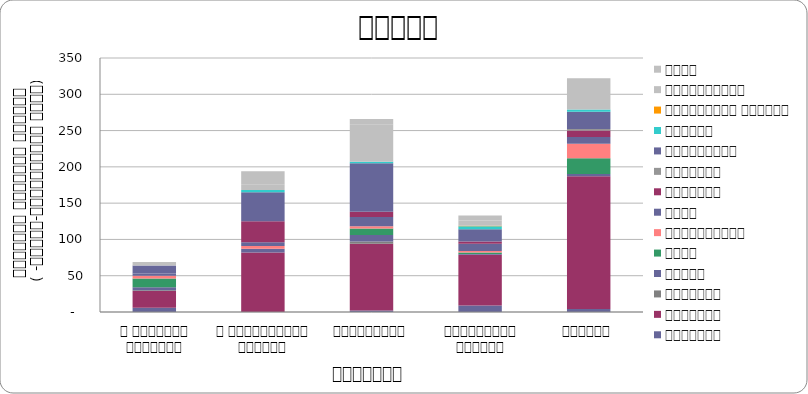
| Category | सुरक्षा | राजनीति | आन्दोलन | न्याय | शासन | अर्थतन्त्र | समाज | कुटनीति | वातावरण | स्वास्थ्य  | शिक्षा | प्राकृतिक प्रकोप | भ्रष्टाचार | अन्य |
|---|---|---|---|---|---|---|---|---|---|---|---|---|---|---|
| द हिमालयन टाइम्स् | 6 | 23 | 1 | 4 | 12 | 4 | 3 | 0 | 0 | 11 | 0 | 0 | 2 | 3 |
| द काठमाण्डौं पोस्ट् | 0 | 82 | 0 | 5 | 0 | 4 | 5 | 29 | 0 | 40 | 3 | 0 | 8 | 18 |
| कान्तिपुर | 2 | 92 | 3 | 9 | 9 | 3 | 13 | 7 | 0 | 67 | 2 | 0 | 51 | 8 |
| अन्नपूर्ण पोस्ट् | 9 | 70 | 0 | 1 | 2 | 2 | 10 | 3 | 0 | 17 | 4 | 1 | 7 | 7 |
| नागरिक | 4 | 183 | 0 | 3 | 22 | 20 | 9 | 9 | 2 | 24 | 3 | 0 | 43 | 0 |